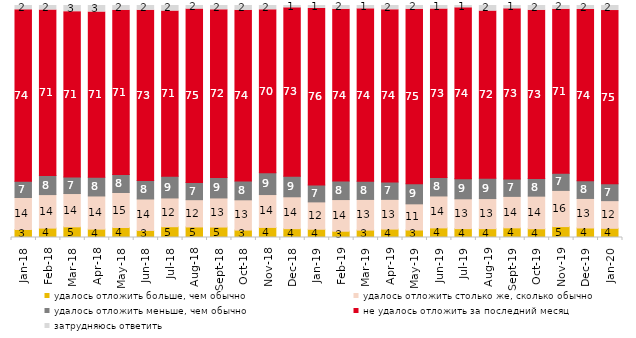
| Category | удалось отложить больше, чем обычно | удалось отложить столько же, сколько обычно | удалось отложить меньше, чем обычно | не удалось отложить за последний месяц | затрудняюсь ответить |
|---|---|---|---|---|---|
| 2018-01-01 | 3.45 | 13.8 | 7 | 73.9 | 1.85 |
| 2018-02-01 | 4.05 | 14.45 | 8.25 | 71.3 | 1.95 |
| 2018-03-01 | 4.6 | 14.35 | 7.1 | 71.3 | 2.65 |
| 2018-04-01 | 3.6 | 14.3 | 8.05 | 71.25 | 2.8 |
| 2018-05-01 | 4.3 | 15.1 | 7.75 | 70.75 | 2.1 |
| 2018-06-01 | 3.05 | 13.55 | 7.95 | 73.4 | 2.05 |
| 2018-07-01 | 4.65 | 12.4 | 9.35 | 71.2 | 2.4 |
| 2018-08-01 | 4.55 | 11.75 | 7.45 | 74.7 | 1.55 |
| 2018-09-01 | 4.5 | 12.55 | 8.8 | 72.3 | 1.85 |
| 2018-10-01 | 3.2 | 13.05 | 8.05 | 73.6 | 2.1 |
| 2018-11-01 | 4.341 | 14.172 | 9.381 | 70.259 | 1.846 |
| 2018-12-01 | 3.8 | 13.75 | 8.9 | 72.55 | 1 |
| 2019-01-01 | 3.55 | 11.8 | 7.25 | 76.1 | 1.3 |
| 2019-02-01 | 2.7 | 13.65 | 7.95 | 74.05 | 1.65 |
| 2019-03-01 | 3.182 | 13.227 | 7.857 | 74.291 | 1.442 |
| 2019-04-01 | 3.614 | 12.822 | 7.475 | 74.257 | 1.832 |
| 2019-05-01 | 3.219 | 11.293 | 8.618 | 75.285 | 1.585 |
| 2019-06-01 | 4.14 | 13.766 | 7.93 | 72.668 | 1.496 |
| 2019-07-01 | 3.812 | 12.871 | 8.663 | 73.663 | 0.99 |
| 2019-08-01 | 3.796 | 12.987 | 8.791 | 72.028 | 2.398 |
| 2019-09-01 | 4.158 | 13.564 | 7.475 | 73.366 | 1.436 |
| 2019-10-01 | 3.762 | 14.059 | 7.574 | 72.525 | 2.079 |
| 2019-11-01 | 4.703 | 15.594 | 7.376 | 70.743 | 1.584 |
| 2019-12-01 | 4.109 | 12.723 | 7.624 | 73.812 | 1.733 |
| 2020-01-01 | 3.96 | 11.931 | 7.228 | 74.703 | 2.178 |